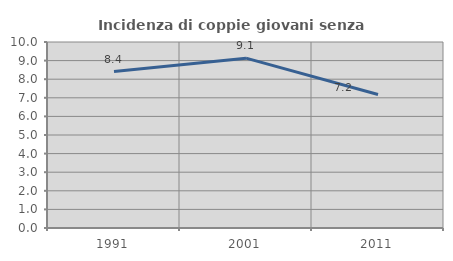
| Category | Incidenza di coppie giovani senza figli |
|---|---|
| 1991.0 | 8.408 |
| 2001.0 | 9.131 |
| 2011.0 | 7.179 |